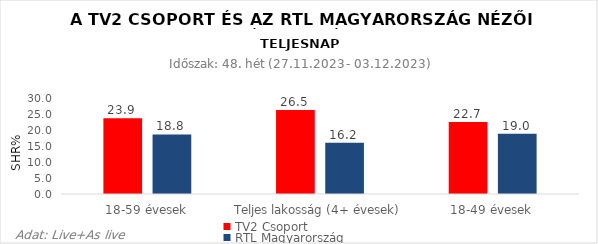
| Category | TV2 Csoport | RTL Magyarország |
|---|---|---|
| 18-59 évesek | 23.9 | 18.8 |
| Teljes lakosság (4+ évesek) | 26.5 | 16.2 |
| 18-49 évesek | 22.7 | 19 |